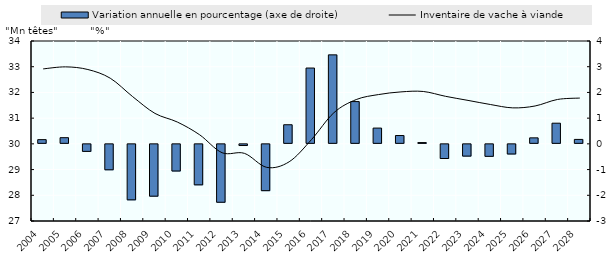
| Category | Variation annuelle en pourcentage (axe de droite) |
|---|---|
| 2004.0 | 0.164 |
| 2005.0 | 0.24 |
| 2006.0 | -0.312 |
| 2007.0 | -1.028 |
| 2008.0 | -2.196 |
| 2009.0 | -2.054 |
| 2010.0 | -1.075 |
| 2011.0 | -1.613 |
| 2012.0 | -2.291 |
| 2013.0 | -0.084 |
| 2014.0 | -1.84 |
| 2015.0 | 0.743 |
| 2016.0 | 2.949 |
| 2017.0 | 3.461 |
| 2018.0 | 1.644 |
| 2019.0 | 0.613 |
| 2020.0 | 0.324 |
| 2021.0 | 0.05 |
| 2022.0 | -0.589 |
| 2023.0 | -0.496 |
| 2024.0 | -0.505 |
| 2025.0 | -0.414 |
| 2026.0 | 0.233 |
| 2027.0 | 0.804 |
| 2028.0 | 0.173 |